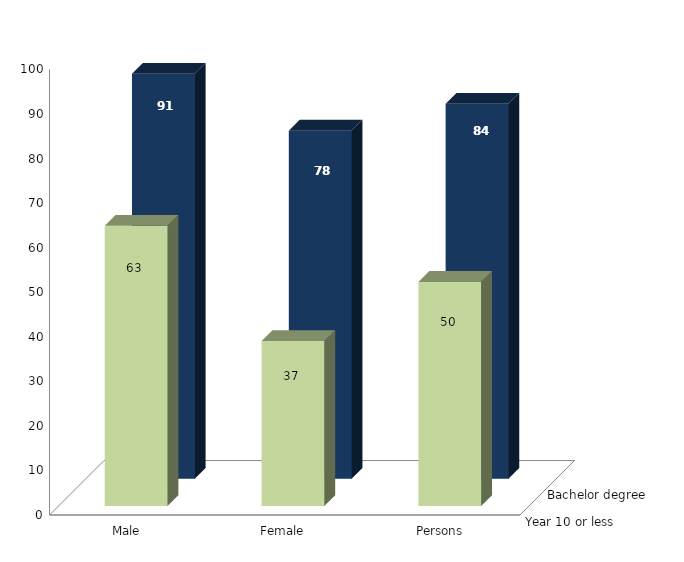
| Category | Year 10 or less | Bachelor degree |
|---|---|---|
| Male | 62.89 | 90.911 |
| Female | 37.024 | 78.146 |
| Persons | 50.295 | 84.163 |